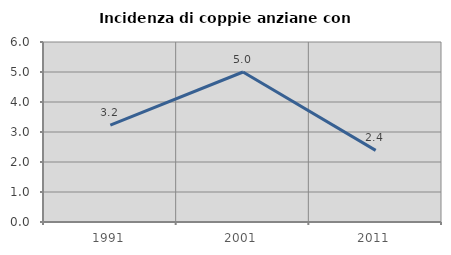
| Category | Incidenza di coppie anziane con figli |
|---|---|
| 1991.0 | 3.226 |
| 2001.0 | 5 |
| 2011.0 | 2.387 |